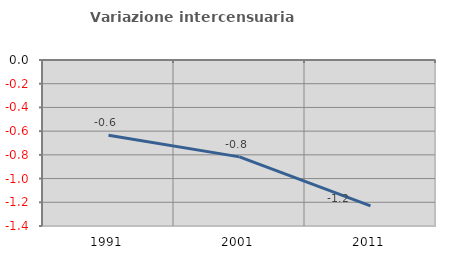
| Category | Variazione intercensuaria annua |
|---|---|
| 1991.0 | -0.634 |
| 2001.0 | -0.817 |
| 2011.0 | -1.23 |